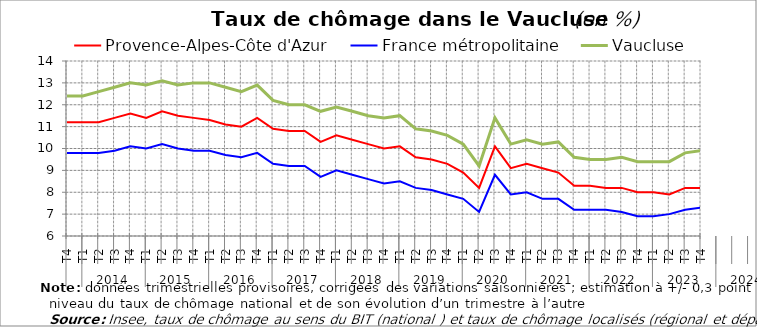
| Category | Provence-Alpes-Côte d'Azur | France métropolitaine | Vaucluse |
|---|---|---|---|
| 0 | 11.2 | 9.8 | 12.4 |
| 1 | 11.2 | 9.8 | 12.4 |
| 2 | 11.2 | 9.8 | 12.6 |
| 3 | 11.4 | 9.9 | 12.8 |
| 4 | 11.6 | 10.1 | 13 |
| 5 | 11.4 | 10 | 12.9 |
| 6 | 11.7 | 10.2 | 13.1 |
| 7 | 11.5 | 10 | 12.9 |
| 8 | 11.4 | 9.9 | 13 |
| 9 | 11.3 | 9.9 | 13 |
| 10 | 11.1 | 9.7 | 12.8 |
| 11 | 11 | 9.6 | 12.6 |
| 12 | 11.4 | 9.8 | 12.9 |
| 13 | 10.9 | 9.3 | 12.2 |
| 14 | 10.8 | 9.2 | 12 |
| 15 | 10.8 | 9.2 | 12 |
| 16 | 10.3 | 8.7 | 11.7 |
| 17 | 10.6 | 9 | 11.9 |
| 18 | 10.4 | 8.8 | 11.7 |
| 19 | 10.2 | 8.6 | 11.5 |
| 20 | 10 | 8.4 | 11.4 |
| 21 | 10.1 | 8.5 | 11.5 |
| 22 | 9.6 | 8.2 | 10.9 |
| 23 | 9.5 | 8.1 | 10.8 |
| 24 | 9.3 | 7.9 | 10.6 |
| 25 | 8.9 | 7.7 | 10.2 |
| 26 | 8.2 | 7.1 | 9.2 |
| 27 | 10.1 | 8.8 | 11.4 |
| 28 | 9.1 | 7.9 | 10.2 |
| 29 | 9.3 | 8 | 10.4 |
| 30 | 9.1 | 7.7 | 10.2 |
| 31 | 8.9 | 7.7 | 10.3 |
| 32 | 8.3 | 7.2 | 9.6 |
| 33 | 8.3 | 7.2 | 9.5 |
| 34 | 8.2 | 7.2 | 9.5 |
| 35 | 8.2 | 7.1 | 9.6 |
| 36 | 8 | 6.9 | 9.4 |
| 37 | 8 | 6.9 | 9.4 |
| 38 | 7.9 | 7 | 9.4 |
| 39 | 8.2 | 7.2 | 9.8 |
| 40 | 8.2 | 7.3 | 9.9 |